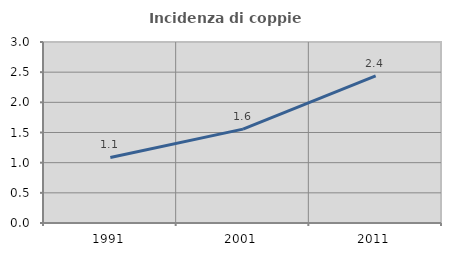
| Category | Incidenza di coppie miste |
|---|---|
| 1991.0 | 1.087 |
| 2001.0 | 1.556 |
| 2011.0 | 2.437 |